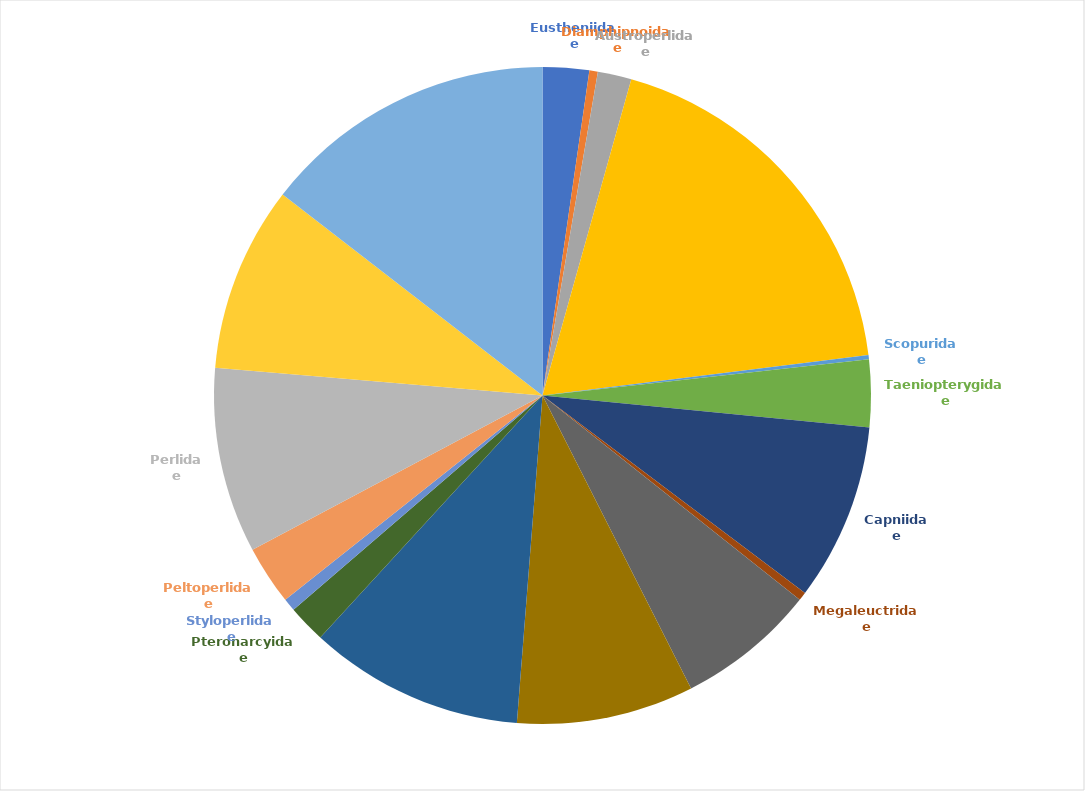
| Category | Series 0 |
|---|---|
| Eustheniidae | 11 |
| Diamphipnoidae | 2 |
| Austroperlidae | 8 |
| Gripopterygidae | 90 |
| Scopuridae | 1 |
| Taeniopterygidae | 16 |
| Capniidae | 42 |
| Megaleuctridae | 2 |
| Leuctridae | 33 |
| Notonemouridae | 42 |
| Nemouridae | 51 |
| Pteronarcyidae | 9 |
| Styloperlidae | 3 |
| Peltoperlidae | 14 |
| Perlidae | 44 |
| Chloroperlidae | 44 |
| Perlodidae | 70 |